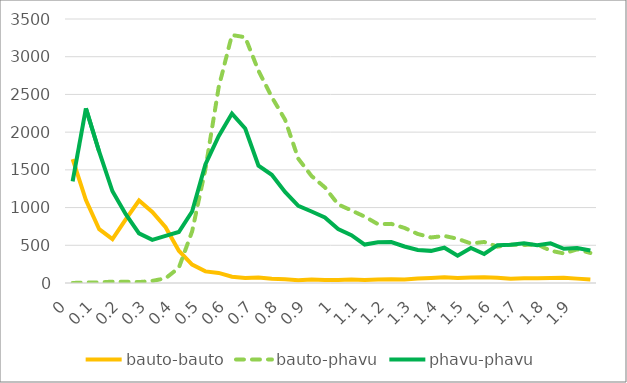
| Category | bauto-bauto | bauto-phavu | phavu-phavu |
|---|---|---|---|
| 0 | 1643 | 0 | 1348 |
| 1 | 1099 | 8 | 2314 |
| 2 | 713 | 8 | 1740 |
| 3 | 582 | 18 | 1216 |
| 4 | 843 | 16 | 912 |
| 5 | 1094 | 12 | 658 |
| 6 | 941 | 28 | 572 |
| 7 | 739 | 62 | 624 |
| 8 | 428 | 202 | 676 |
| 9 | 245 | 684 | 948 |
| 10 | 154 | 1508 | 1572 |
| 11 | 134 | 2594 | 1946 |
| 12 | 83 | 3288 | 2246 |
| 13 | 66 | 3258 | 2048 |
| 14 | 72 | 2814 | 1556 |
| 15 | 57 | 2466 | 1434 |
| 16 | 49 | 2166 | 1208 |
| 17 | 38 | 1648 | 1024 |
| 18 | 45 | 1418 | 948 |
| 19 | 41 | 1268 | 868 |
| 20 | 40 | 1042 | 716 |
| 21 | 45 | 962 | 634 |
| 22 | 40 | 880 | 510 |
| 23 | 48 | 780 | 540 |
| 24 | 51 | 784 | 542 |
| 25 | 46 | 730 | 484 |
| 26 | 60 | 650 | 438 |
| 27 | 67 | 604 | 426 |
| 28 | 76 | 624 | 468 |
| 29 | 66 | 586 | 362 |
| 30 | 72 | 524 | 464 |
| 31 | 75 | 544 | 384 |
| 32 | 71 | 482 | 502 |
| 33 | 55 | 508 | 508 |
| 34 | 64 | 504 | 526 |
| 35 | 62 | 512 | 500 |
| 36 | 65 | 428 | 526 |
| 37 | 68 | 392 | 454 |
| 38 | 58 | 446 | 464 |
| 39 | 48 | 398 | 430 |